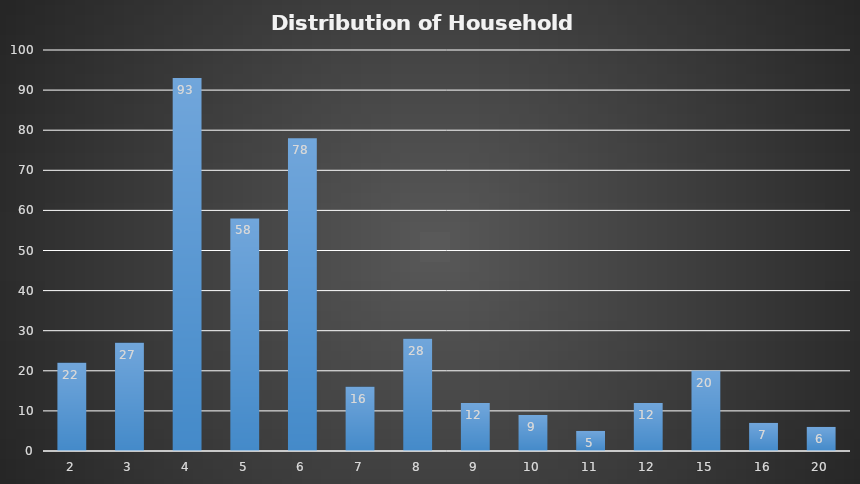
| Category | Frequency |
|---|---|
| 2.0 | 22 |
| 3.0 | 27 |
| 4.0 | 93 |
| 5.0 | 58 |
| 6.0 | 78 |
| 7.0 | 16 |
| 8.0 | 28 |
| 9.0 | 12 |
| 10.0 | 9 |
| 11.0 | 5 |
| 12.0 | 12 |
| 15.0 | 20 |
| 16.0 | 7 |
| 20.0 | 6 |